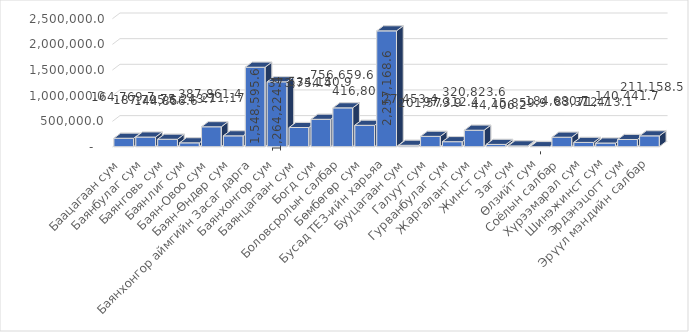
| Category | Total |
|---|---|
| Баацагаан сум | 164769.688 |
| Баянбулаг сум | 187795.6 |
| Баянговь сум | 144856.612 |
| Баянлиг сум | 75243.694 |
| Баян-Овоо сум | 387861.4 |
| Баян-Өндөр сум | 211170.932 |
| Баянхонгор аймгийн Засаг дарга | 1548595.583 |
| Баянхонгор сум | 1264224.411 |
| Баянцагаан сум | 373754.437 |
| Богд сум | 534150.922 |
| Боловсролын салбар | 756659.622 |
| Бөмбөгөр сум | 416804.803 |
| Бусад ТЕЗ-ийн харьяа | 2257168.606 |
| Бууцагаан сум | 27453.4 |
| Галуут сум | 201579.9 |
| Гурванбулаг сум | 97312.35 |
| Жаргалант сум | 320823.58 |
| Жинст сум | 44406.2 |
| Заг сум | 15859.9 |
| Өлзийт сум | 0 |
| Соёлын салбар | 184680.701 |
| Хүрээмарал сум | 83312.687 |
| Шинэжинст сум | 71413.1 |
| Эрдэнэцогт сум | 140441.7 |
| Эрүүл мэндийн салбар | 211158.479 |